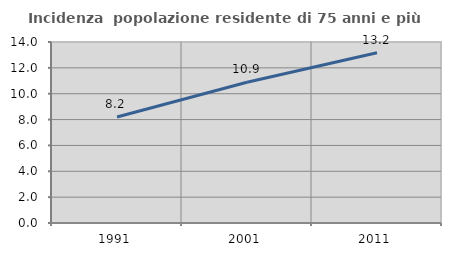
| Category | Incidenza  popolazione residente di 75 anni e più |
|---|---|
| 1991.0 | 8.194 |
| 2001.0 | 10.892 |
| 2011.0 | 13.17 |